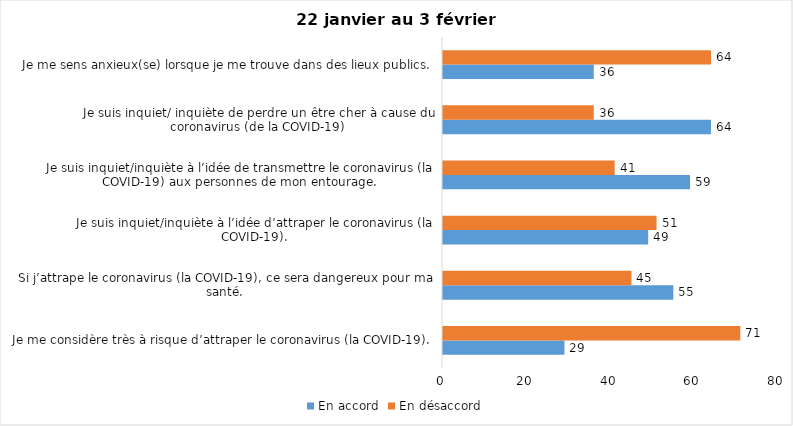
| Category | En accord | En désaccord |
|---|---|---|
| Je me considère très à risque d’attraper le coronavirus (la COVID-19). | 29 | 71 |
| Si j’attrape le coronavirus (la COVID-19), ce sera dangereux pour ma santé. | 55 | 45 |
| Je suis inquiet/inquiète à l’idée d’attraper le coronavirus (la COVID-19). | 49 | 51 |
| Je suis inquiet/inquiète à l’idée de transmettre le coronavirus (la COVID-19) aux personnes de mon entourage. | 59 | 41 |
| Je suis inquiet/ inquiète de perdre un être cher à cause du coronavirus (de la COVID-19) | 64 | 36 |
| Je me sens anxieux(se) lorsque je me trouve dans des lieux publics. | 36 | 64 |